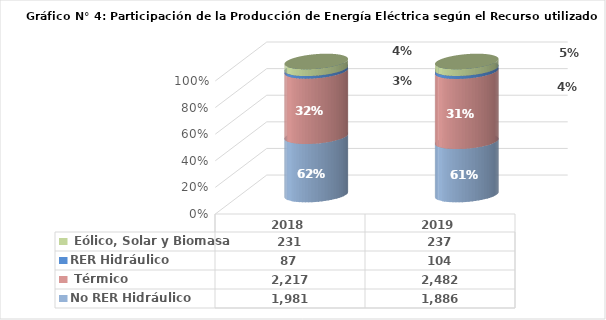
| Category | No RER | RER |
|---|---|---|
| 2018.0 | 2216.83 | 230.876 |
| 2019.0 | 2482.44 | 237.295 |